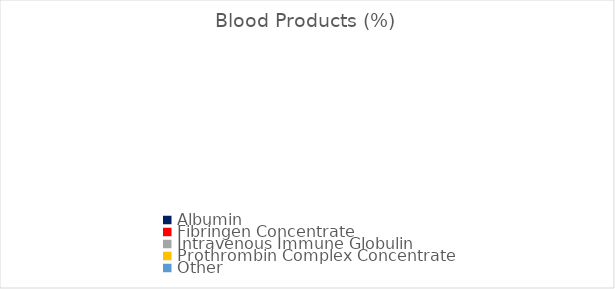
| Category | Series 0 |
|---|---|
| Albumin | 0 |
| Fibringen Concentrate | 0 |
| Intravenous Immune Globulin | 0 |
| Prothrombin Complex Concentrate | 0 |
| Other | 0 |